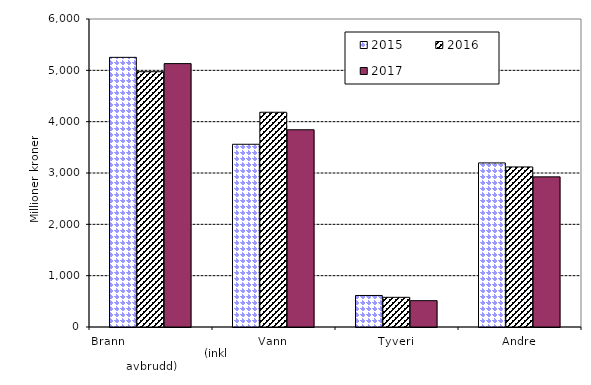
| Category | 2015 | 2016 | 2017 |
|---|---|---|---|
| Brann                                                       (inkl avbrudd) | 5253.019 | 4973.264 | 5130.97 |
| Vann | 3559.668 | 4183.152 | 3842.246 |
| Tyveri | 613.944 | 578.224 | 513.098 |
| Andre | 3196.442 | 3118.369 | 2924.613 |